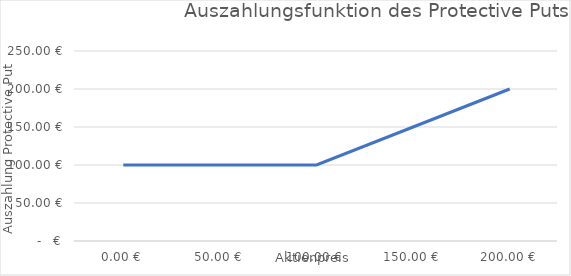
| Category | Protective Put |
|---|---|
| 0.0 | 100 |
| 50.0 | 100 |
| 100.0 | 100 |
| 150.0 | 150 |
| 200.0 | 200 |